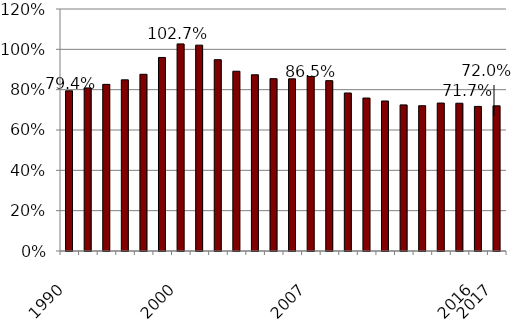
| Category | Series 0 |
|---|---|
| 1990.0 | 0.794 |
| nan | 0.808 |
| nan | 0.826 |
| nan | 0.849 |
| nan | 0.876 |
| nan | 0.96 |
| 2000.0 | 1.027 |
| nan | 1.021 |
| nan | 0.949 |
| nan | 0.891 |
| nan | 0.874 |
| nan | 0.855 |
| nan | 0.854 |
| 2007.0 | 0.865 |
| nan | 0.845 |
| nan | 0.783 |
| nan | 0.758 |
| nan | 0.744 |
| nan | 0.724 |
| nan | 0.72 |
| nan | 0.734 |
| nan | 0.733 |
| 2016.0 | 0.717 |
| 2017.0 | 0.72 |